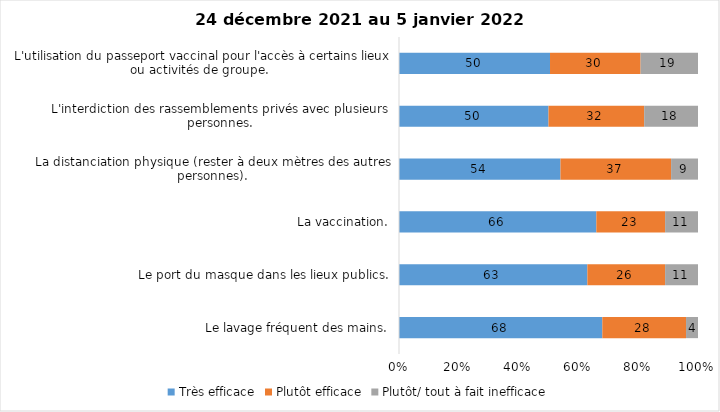
| Category | Très efficace | Plutôt efficace | Plutôt/ tout à fait inefficace |
|---|---|---|---|
| Le lavage fréquent des mains. | 68 | 28 | 4 |
| Le port du masque dans les lieux publics. | 63 | 26 | 11 |
| La vaccination. | 66 | 23 | 11 |
| La distanciation physique (rester à deux mètres des autres personnes). | 54 | 37 | 9 |
| L'interdiction des rassemblements privés avec plusieurs personnes. | 50 | 32 | 18 |
| L'utilisation du passeport vaccinal pour l'accès à certains lieux ou activités de groupe.  | 50 | 30 | 19 |